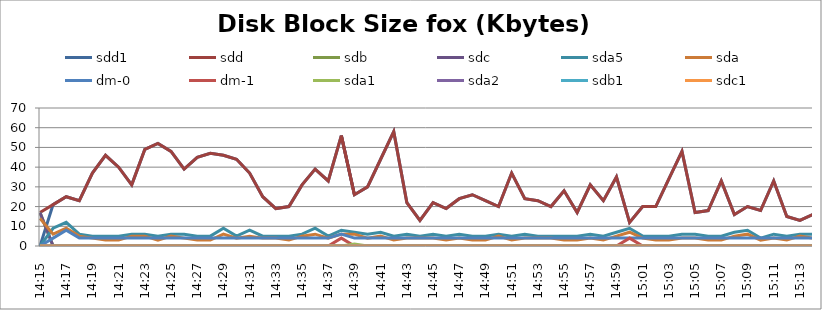
| Category | sdd1 | sdd | sdb | sdc | sda5 | sda | dm-0 | dm-1 | sda1 | sda2 | sdb1 | sdc1 |
|---|---|---|---|---|---|---|---|---|---|---|---|---|
| 14:15 | 0 | 17 | 17 | 17 | 0 | 14 | 0 | 0 | 0 | 0 | 0 | 0 |
| 14:16 | 21 | 21 | 0 | 0 | 9 | 6 | 4 | 0 | 0 | 0 | 0 | 0 |
| 14:17 | 25 | 25 | 0 | 0 | 12 | 9 | 8 | 0 | 0 | 0 | 0 | 0 |
| 14:18 | 23 | 23 | 0 | 0 | 6 | 5 | 4 | 0 | 0 | 0 | 0 | 0 |
| 14:19 | 37 | 37 | 0 | 0 | 5 | 4 | 4 | 0 | 0 | 0 | 0 | 0 |
| 14:20 | 46 | 46 | 0 | 0 | 5 | 3 | 4 | 0 | 0 | 0 | 0 | 0 |
| 14:21 | 40 | 40 | 0 | 0 | 5 | 3 | 4 | 0 | 0 | 0 | 0 | 0 |
| 14:22 | 31 | 31 | 0 | 0 | 6 | 5 | 4 | 0 | 0 | 0 | 0 | 0 |
| 14:23 | 49 | 49 | 0 | 0 | 6 | 5 | 4 | 0 | 0 | 0 | 0 | 0 |
| 14:24 | 52 | 52 | 0 | 0 | 5 | 3 | 4 | 0 | 0 | 0 | 0 | 0 |
| 14:25 | 48 | 48 | 0 | 0 | 6 | 5 | 4 | 0 | 0 | 0 | 0 | 0 |
| 14:26 | 39 | 39 | 0 | 0 | 6 | 4 | 4 | 0 | 0 | 0 | 0 | 0 |
| 14:27 | 45 | 45 | 0 | 0 | 5 | 3 | 4 | 0 | 0 | 0 | 0 | 0 |
| 14:28 | 47 | 47 | 0 | 0 | 5 | 3 | 4 | 0 | 0 | 0 | 0 | 0 |
| 14:29 | 46 | 46 | 0 | 0 | 9 | 6 | 4 | 0 | 0 | 0 | 0 | 0 |
| 14:30 | 44 | 44 | 0 | 0 | 5 | 4 | 4 | 0 | 0 | 0 | 0 | 0 |
| 14:31 | 37 | 37 | 0 | 0 | 8 | 5 | 4 | 0 | 0 | 0 | 0 | 0 |
| 14:32 | 25 | 25 | 0 | 0 | 5 | 4 | 4 | 0 | 0 | 0 | 0 | 0 |
| 14:33 | 19 | 19 | 0 | 0 | 5 | 4 | 4 | 0 | 0 | 0 | 0 | 0 |
| 14:34 | 20 | 20 | 0 | 0 | 5 | 3 | 4 | 0 | 0 | 0 | 0 | 0 |
| 14:35 | 31 | 31 | 0 | 0 | 6 | 5 | 4 | 0 | 0 | 0 | 0 | 0 |
| 14:36 | 39 | 39 | 0 | 0 | 9 | 6 | 4 | 0 | 0 | 0 | 0 | 0 |
| 14:37 | 33 | 33 | 0 | 0 | 5 | 4 | 4 | 0 | 0 | 0 | 0 | 0 |
| 14:38 | 56 | 56 | 0 | 0 | 8 | 6 | 6 | 4 | 0 | 0 | 0 | 0 |
| 14:39 | 26 | 26 | 0 | 0 | 7 | 6 | 4 | 0 | 1 | 0 | 0 | 0 |
| 14:40 | 30 | 30 | 0 | 0 | 6 | 4 | 4 | 0 | 0 | 0 | 0 | 0 |
| 14:41 | 44 | 44 | 0 | 0 | 7 | 5 | 4 | 0 | 0 | 0 | 0 | 0 |
| 14:42 | 58 | 58 | 0 | 0 | 5 | 3 | 4 | 0 | 0 | 0 | 0 | 0 |
| 14:43 | 22 | 22 | 0 | 0 | 6 | 4 | 4 | 0 | 0 | 0 | 0 | 0 |
| 14:44 | 13 | 13 | 0 | 0 | 5 | 4 | 4 | 0 | 0 | 0 | 0 | 0 |
| 14:45 | 22 | 22 | 0 | 0 | 6 | 4 | 4 | 0 | 0 | 0 | 0 | 0 |
| 14:46 | 19 | 19 | 0 | 0 | 5 | 3 | 4 | 0 | 0 | 0 | 0 | 0 |
| 14:47 | 24 | 24 | 0 | 0 | 6 | 4 | 4 | 0 | 0 | 0 | 0 | 0 |
| 14:48 | 26 | 26 | 0 | 0 | 5 | 3 | 4 | 0 | 0 | 0 | 0 | 0 |
| 14:49 | 23 | 23 | 0 | 0 | 5 | 3 | 4 | 0 | 0 | 0 | 0 | 0 |
| 14:50 | 20 | 20 | 0 | 0 | 6 | 5 | 4 | 0 | 0 | 0 | 0 | 0 |
| 14:51 | 37 | 37 | 0 | 0 | 5 | 3 | 4 | 0 | 0 | 0 | 0 | 0 |
| 14:52 | 24 | 24 | 0 | 0 | 6 | 4 | 4 | 0 | 0 | 0 | 0 | 0 |
| 14:53 | 23 | 23 | 0 | 0 | 5 | 4 | 4 | 0 | 0 | 0 | 0 | 0 |
| 14:54 | 20 | 20 | 0 | 0 | 5 | 4 | 4 | 0 | 0 | 0 | 0 | 0 |
| 14:55 | 28 | 28 | 0 | 0 | 5 | 3 | 4 | 0 | 0 | 0 | 0 | 0 |
| 14:56 | 17 | 17 | 0 | 0 | 5 | 3 | 4 | 0 | 0 | 0 | 0 | 0 |
| 14:57 | 31 | 31 | 0 | 0 | 6 | 4 | 4 | 0 | 0 | 0 | 0 | 0 |
| 14:58 | 23 | 23 | 0 | 0 | 5 | 3 | 4 | 0 | 0 | 0 | 0 | 0 |
| 14:59 | 35 | 35 | 0 | 0 | 7 | 5 | 4 | 0 | 0 | 0 | 0 | 0 |
| 15:00 | 12 | 12 | 0 | 0 | 9 | 7 | 4 | 4 | 0 | 0 | 0 | 0 |
| 15:01 | 20 | 20 | 0 | 0 | 5 | 4 | 4 | 0 | 0 | 0 | 0 | 0 |
| 15:02 | 20 | 20 | 0 | 0 | 5 | 3 | 4 | 0 | 0 | 0 | 0 | 0 |
| 15:03 | 34 | 34 | 0 | 0 | 5 | 3 | 4 | 0 | 0 | 0 | 0 | 0 |
| 15:04 | 48 | 48 | 0 | 0 | 6 | 4 | 4 | 0 | 0 | 0 | 0 | 0 |
| 15:05 | 17 | 17 | 0 | 0 | 6 | 4 | 4 | 0 | 0 | 0 | 0 | 0 |
| 15:06 | 18 | 18 | 0 | 0 | 5 | 3 | 4 | 0 | 0 | 0 | 0 | 0 |
| 15:07 | 33 | 33 | 0 | 0 | 5 | 3 | 4 | 0 | 0 | 0 | 0 | 0 |
| 15:08 | 16 | 16 | 0 | 0 | 7 | 5 | 4 | 0 | 0 | 0 | 0 | 0 |
| 15:09 | 20 | 20 | 0 | 0 | 8 | 6 | 4 | 0 | 0 | 0 | 0 | 0 |
| 15:10 | 18 | 18 | 0 | 0 | 4 | 3 | 4 | 0 | 0 | 0 | 0 | 0 |
| 15:11 | 33 | 33 | 0 | 0 | 6 | 4 | 4 | 0 | 0 | 0 | 0 | 0 |
| 15:12 | 15 | 15 | 0 | 0 | 5 | 3 | 4 | 0 | 0 | 0 | 0 | 0 |
| 15:13 | 13 | 13 | 0 | 0 | 6 | 5 | 4 | 0 | 0 | 0 | 0 | 0 |
| 15:14 | 16 | 16 | 0 | 0 | 6 | 4 | 4 | 0 | 0 | 0 | 0 | 0 |